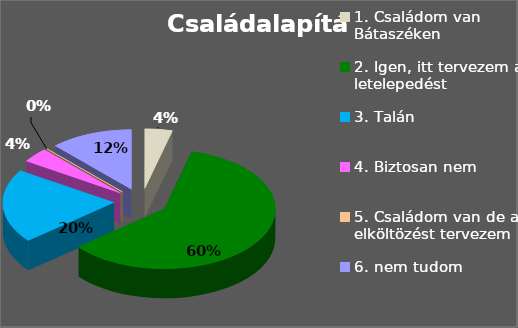
| Category | Series 0 |
|---|---|
| 1. Családom van Bátaszéken | 4 |
| 2. Igen, itt tervezem a letelepedést | 60 |
| 3. Talán | 20 |
| 4. Biztosan nem | 4 |
| 5. Családom van de az elköltözést tervezem | 0 |
| 6. nem tudom | 12 |